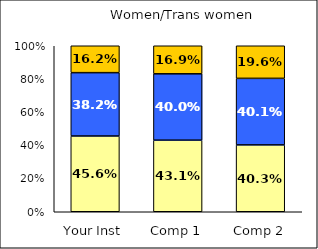
| Category | Low Social Self-Concept | Average Social Self-Concept | High Social Self-Concept |
|---|---|---|---|
| Your Inst | 0.456 | 0.382 | 0.162 |
| Comp 1 | 0.431 | 0.4 | 0.169 |
| Comp 2 | 0.403 | 0.401 | 0.196 |